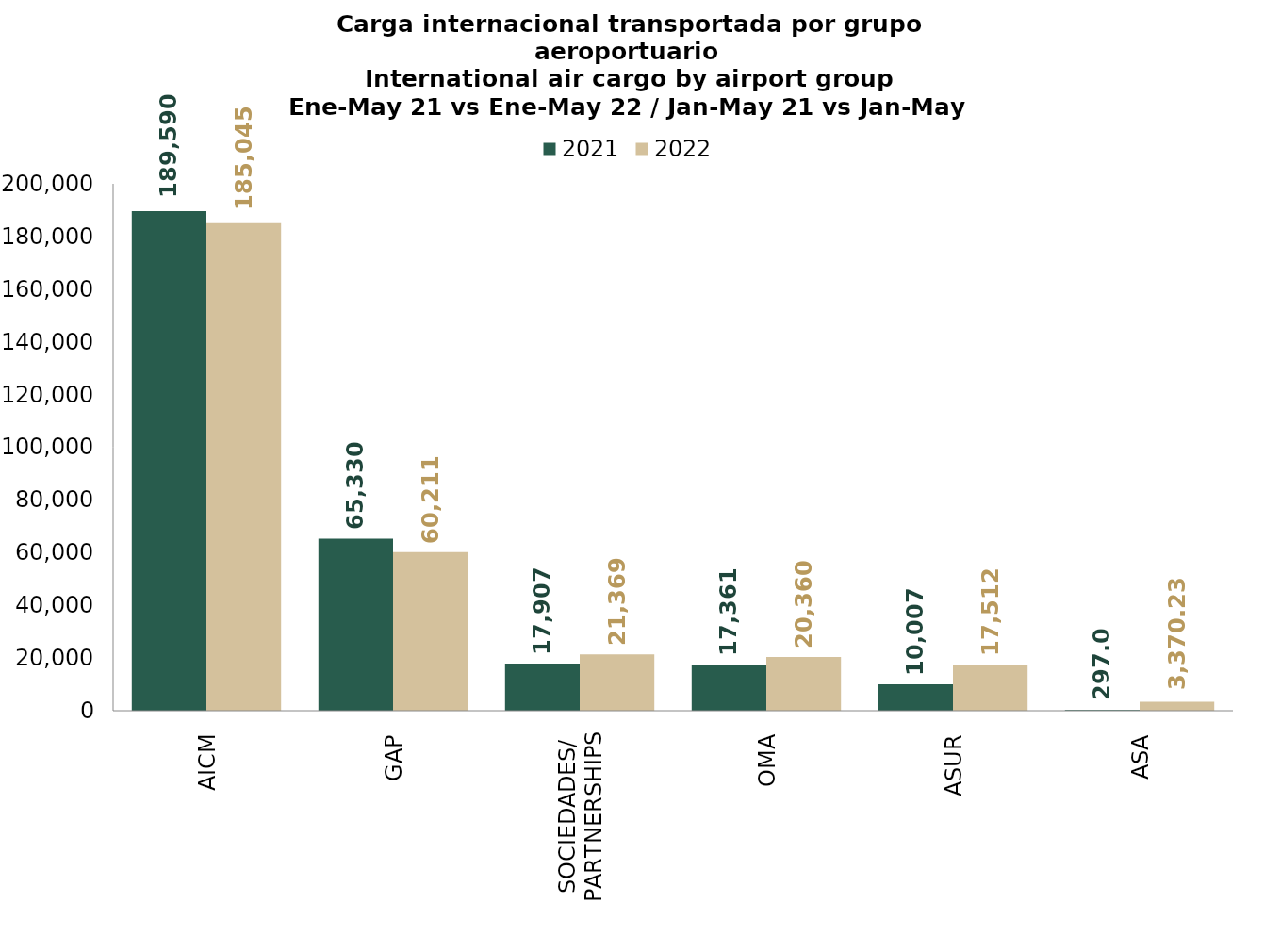
| Category | 2021 | 2022 |
|---|---|---|
| AICM | 189589.58 | 185045.401 |
| GAP | 65330.188 | 60211.34 |
| SOCIEDADES/
PARTNERSHIPS | 17906.729 | 21368.81 |
| OMA | 17361.142 | 20360.434 |
| ASUR | 10006.901 | 17511.512 |
| ASA | 296.966 | 3370.225 |